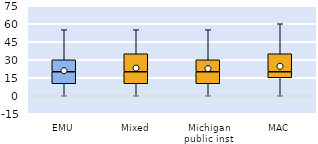
| Category | 25th | 50th | 75th |
|---|---|---|---|
| EMU | 10 | 10 | 10 |
| Mixed | 10 | 10 | 15 |
| Michigan public inst | 10 | 10 | 10 |
| MAC | 15 | 5 | 15 |